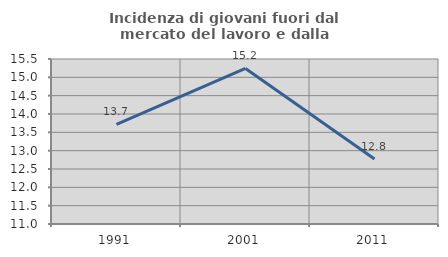
| Category | Incidenza di giovani fuori dal mercato del lavoro e dalla formazione  |
|---|---|
| 1991.0 | 13.718 |
| 2001.0 | 15.242 |
| 2011.0 | 12.77 |